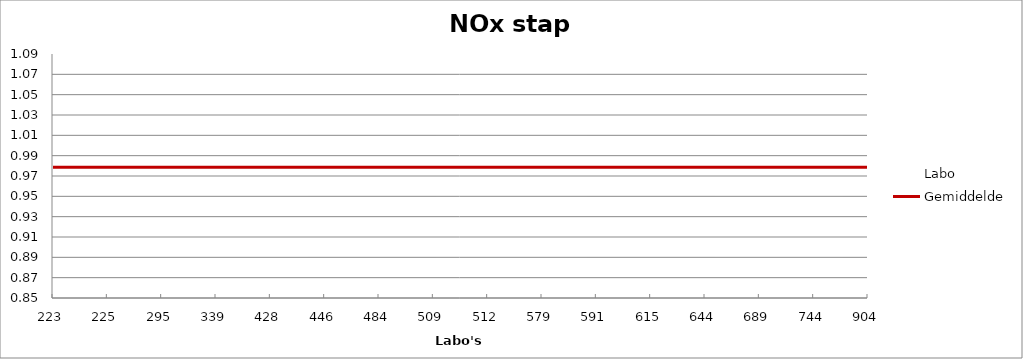
| Category | Labo | Gemiddelde |
|---|---|---|
| 223.0 | 1.042 | 0.979 |
| 225.0 | 0.948 | 0.979 |
| 295.0 | 1.052 | 0.979 |
| 339.0 | 0.892 | 0.979 |
| 428.0 | 1.032 | 0.979 |
| 446.0 | 0.975 | 0.979 |
| 484.0 | 0.96 | 0.979 |
| 509.0 | 0.983 | 0.979 |
| 512.0 | 0.948 | 0.979 |
| 579.0 | 0.981 | 0.979 |
| 591.0 | 1.003 | 0.979 |
| 615.0 | 0.92 | 0.979 |
| 644.0 | 1.052 | 0.979 |
| 689.0 | 0.933 | 0.979 |
| 744.0 | 0.993 | 0.979 |
| 904.0 | 0.938 | 0.979 |